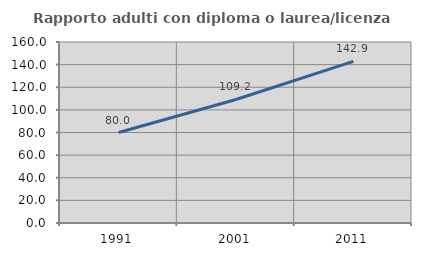
| Category | Rapporto adulti con diploma o laurea/licenza media  |
|---|---|
| 1991.0 | 80 |
| 2001.0 | 109.174 |
| 2011.0 | 142.857 |